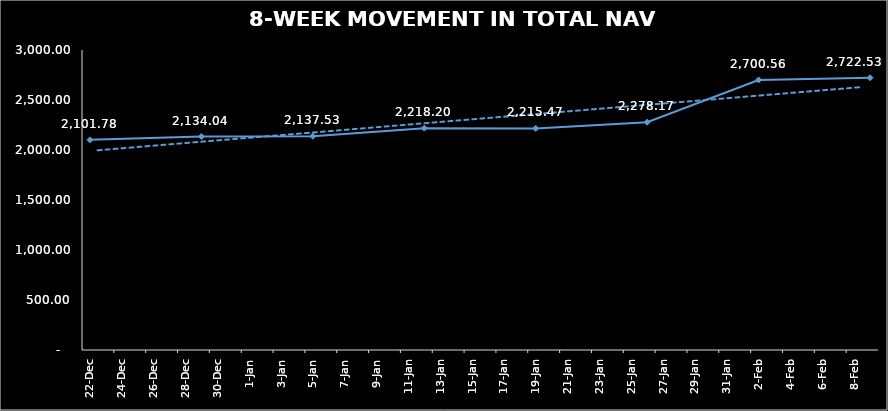
| Category | TOTAL NAV |
|---|---|
| 2023-12-22 | 2101.782 |
| 2023-12-29 | 2134.045 |
| 2024-01-05 | 2137.525 |
| 2024-01-12 | 2218.205 |
| 2024-01-19 | 2215.471 |
| 2024-01-26 | 2278.172 |
| 2024-02-02 | 2700.559 |
| 2024-02-09 | 2722.532 |